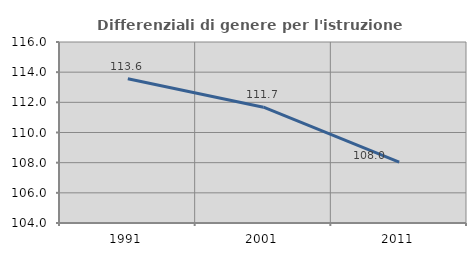
| Category | Differenziali di genere per l'istruzione superiore |
|---|---|
| 1991.0 | 113.569 |
| 2001.0 | 111.676 |
| 2011.0 | 108.037 |